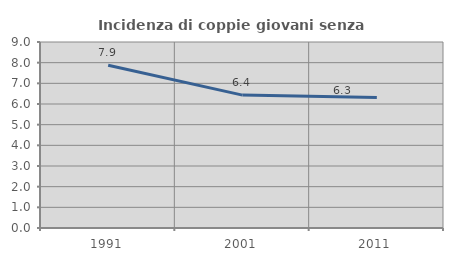
| Category | Incidenza di coppie giovani senza figli |
|---|---|
| 1991.0 | 7.877 |
| 2001.0 | 6.431 |
| 2011.0 | 6.309 |